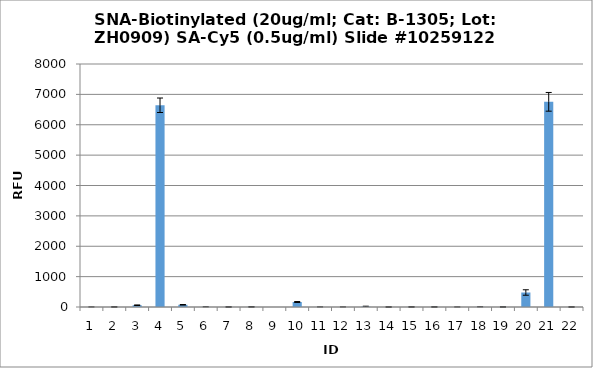
| Category | Series 0 |
|---|---|
| 0 | 1 |
| 1 | 1.75 |
| 2 | 58.25 |
| 3 | 6641.25 |
| 4 | 73 |
| 5 | 3.25 |
| 6 | 1.25 |
| 7 | 3.25 |
| 8 | -3 |
| 9 | 164.5 |
| 10 | 1.25 |
| 11 | 0.5 |
| 12 | 12.25 |
| 13 | -1 |
| 14 | 1.75 |
| 15 | 2 |
| 16 | 0.75 |
| 17 | 2.75 |
| 18 | 1.5 |
| 19 | 477.25 |
| 20 | 6754.75 |
| 21 | 1 |